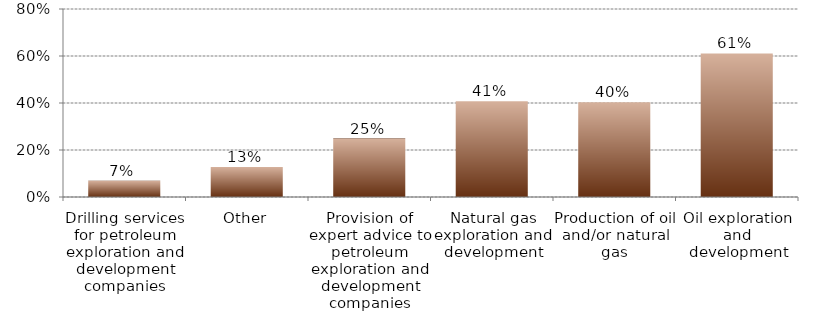
| Category | Series 0 |
|---|---|
| Drilling services for petroleum exploration and development companies | 0.07 |
| Other | 0.128 |
| Provision of expert advice to petroleum exploration and development companies | 0.249 |
| Natural gas exploration and development | 0.408 |
| Production of oil and/or natural gas | 0.403 |
| Oil exploration and development | 0.611 |